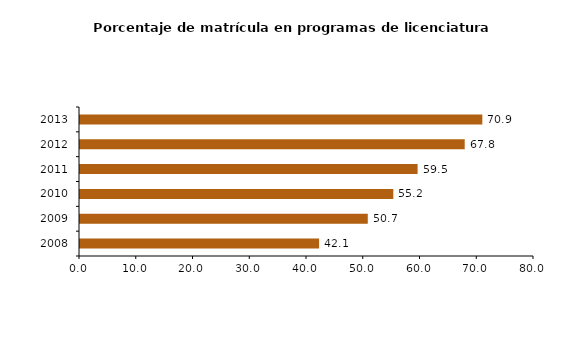
| Category | Matrícula |
|---|---|
| 2008.0 | 42.13 |
| 2009.0 | 50.71 |
| 2010.0 | 55.21 |
| 2011.0 | 59.49 |
| 2012.0 | 67.79 |
| 2013.0 | 70.896 |